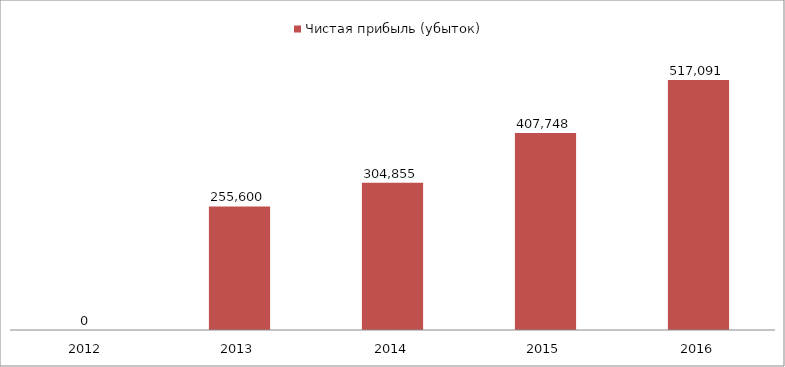
| Category | Чистая прибыль (убыток) |
|---|---|
| 2012.0 | 0 |
| 2013.0 | 255599.785 |
| 2014.0 | 304854.595 |
| 2015.0 | 407747.551 |
| 2016.0 | 517090.753 |